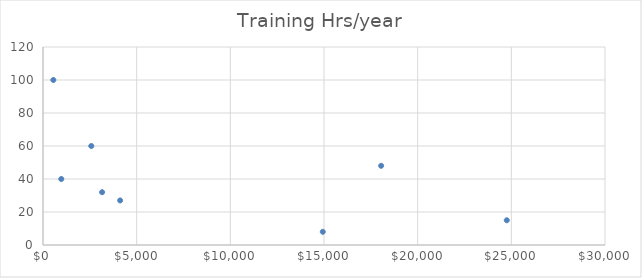
| Category | Training Hrs/year |
|---|---|
| 24757.0 | 15 |
| 552.0 | 100 |
| 3154.0 | 32 |
| 2577.0 | 60 |
| 976.0 | 40 |
| 18050.0 | 48 |
| 4118.0 | 27 |
| 14936.0 | 8 |